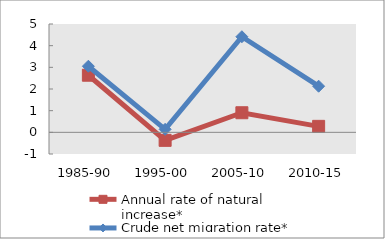
| Category | Annual rate of natural increase* | Crude net migration rate* |
|---|---|---|
| 1985-90 | 2.636 | 3.051 |
| 1995-00 | -0.37 | 0.138 |
| 2005-10 | 0.904 | 4.412 |
| 2010-15 | 0.276 | 2.129 |